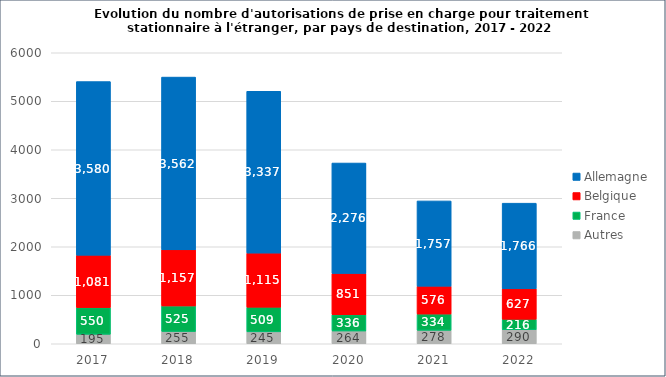
| Category | Autres | France | Belgique | Allemagne |
|---|---|---|---|---|
| 2017.0 | 195 | 550 | 1081 | 3580 |
| 2018.0 | 255 | 525 | 1157 | 3562 |
| 2019.0 | 245 | 509 | 1115 | 3337 |
| 2020.0 | 264 | 336 | 851 | 2276 |
| 2021.0 | 278 | 334 | 576 | 1757 |
| 2022.0 | 290 | 216 | 627 | 1766 |